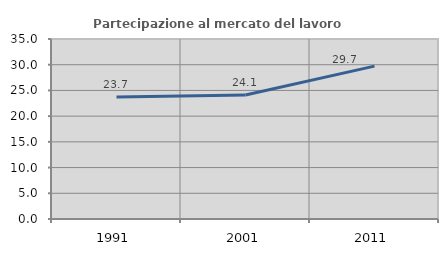
| Category | Partecipazione al mercato del lavoro  femminile |
|---|---|
| 1991.0 | 23.711 |
| 2001.0 | 24.096 |
| 2011.0 | 29.73 |